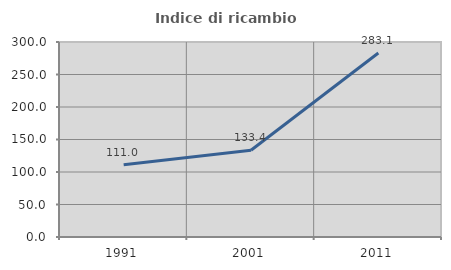
| Category | Indice di ricambio occupazionale  |
|---|---|
| 1991.0 | 111.049 |
| 2001.0 | 133.441 |
| 2011.0 | 283.121 |